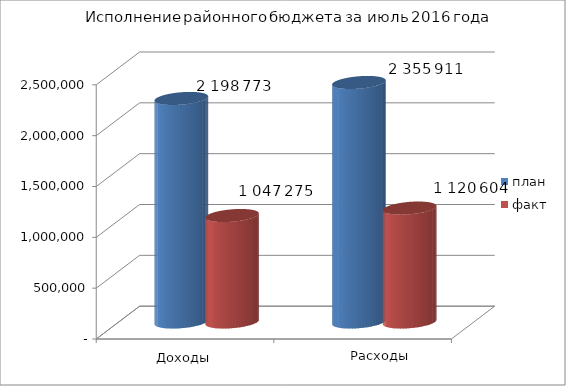
| Category | план | факт |
|---|---|---|
| 0 | 2198773 | 1047275 |
| 1 | 2355911 | 1120604 |